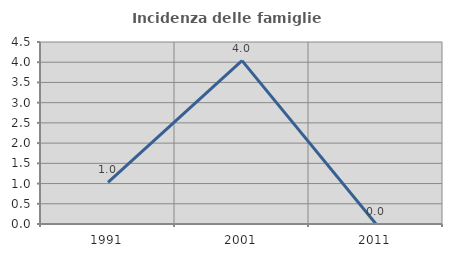
| Category | Incidenza delle famiglie numerose |
|---|---|
| 1991.0 | 1.031 |
| 2001.0 | 4.04 |
| 2011.0 | 0 |